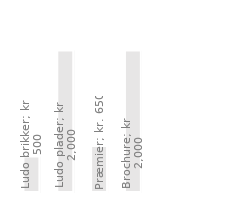
| Category | Stævne udgifter |
|---|---|
| Ludo brikker | 500 |
| Ludo plader | 2000 |
| Præmier | 650 |
| Brochure | 2000 |